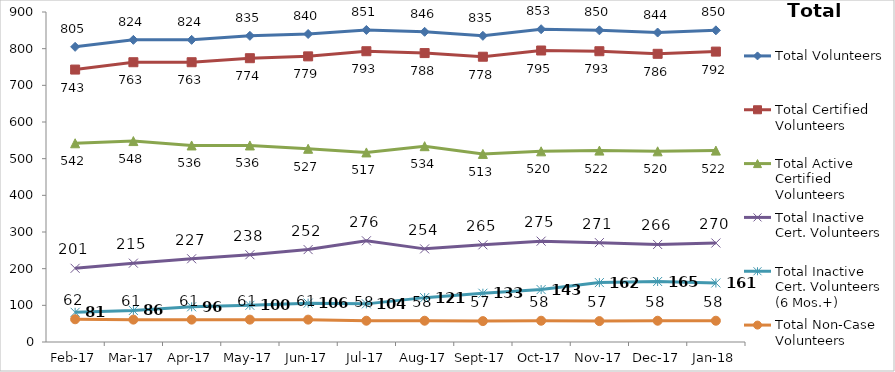
| Category | Total Volunteers | Total Certified Volunteers | Total Active Certified Volunteers | Total Inactive Cert. Volunteers | Total Inactive Cert. Volunteers (6 Mos.+) | Total Non-Case Volunteers |
|---|---|---|---|---|---|---|
| 2017-02-01 | 805 | 743 | 542 | 201 | 81 | 62 |
| 2017-03-01 | 824 | 763 | 548 | 215 | 86 | 61 |
| 2017-04-01 | 824 | 763 | 536 | 227 | 96 | 61 |
| 2017-05-01 | 835 | 774 | 536 | 238 | 100 | 61 |
| 2017-06-01 | 840 | 779 | 527 | 252 | 106 | 61 |
| 2017-07-01 | 851 | 793 | 517 | 276 | 104 | 58 |
| 2017-08-01 | 846 | 788 | 534 | 254 | 121 | 58 |
| 2017-09-01 | 835 | 778 | 513 | 265 | 133 | 57 |
| 2017-10-01 | 853 | 795 | 520 | 275 | 143 | 58 |
| 2017-11-01 | 850 | 793 | 522 | 271 | 162 | 57 |
| 2017-12-01 | 844 | 786 | 520 | 266 | 165 | 58 |
| 2018-01-01 | 850 | 792 | 522 | 270 | 161 | 58 |